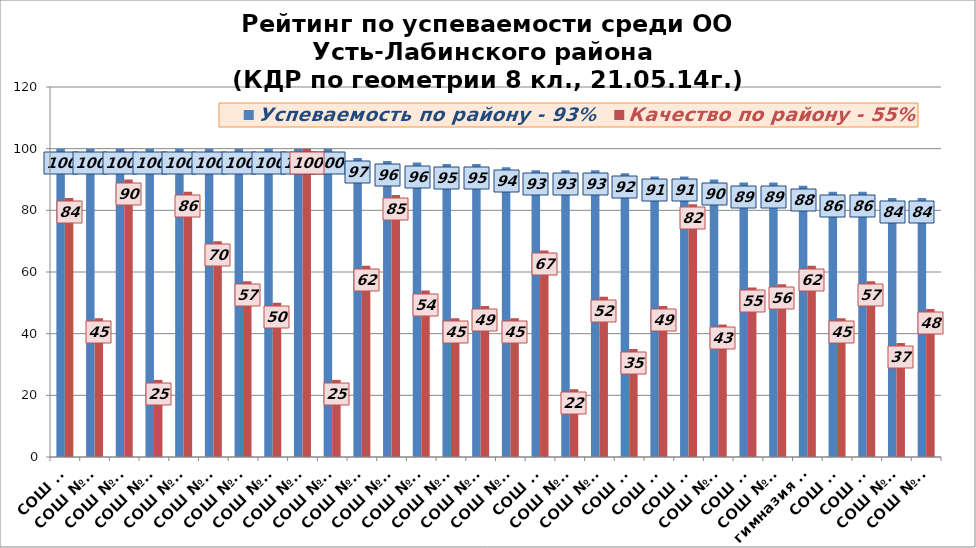
| Category | Успеваемость по району - 93% | Качество по району - 55% |
|---|---|---|
| СОШ №2 | 100 | 84 |
| СОШ №15 | 100 | 45 |
| СОШ №16 | 100 | 90 |
| СОШ №17 | 100 | 25 |
| СОШ №18 | 100 | 86 |
| СОШ №20 | 100 | 70 |
| СОШ №21 | 100 | 57 |
| СОШ №26 | 100 | 50 |
| СОШ №27 | 100 | 100 |
| СОШ №31 | 100 | 25 |
| СОШ №12 | 97 | 62 |
| СОШ №10 | 96 | 85 |
| СОШ №11 | 95.5 | 54 |
| СОШ №23 | 95 | 45 |
| СОШ №25 | 95 | 49 |
| СОШ №13 | 94 | 45 |
| СОШ №4 | 93 | 67 |
| СОШ №24 | 93 | 22 |
| СОШ №36 | 93 | 52 |
| СОШ №6 | 92 | 35 |
| СОШ №3 | 91 | 49 |
| СОШ №9 | 91 | 82 |
| СОШ №19 | 90 | 43 |
| СОШ №1 | 89 | 55 |
| СОШ №28 | 89 | 56 |
| гимназия №5 | 88 | 62 |
| СОШ №7 | 86 | 45 |
| СОШ №8 | 86 | 57 |
| СОШ №14 | 84 | 37 |
| СОШ №22 | 84 | 48 |